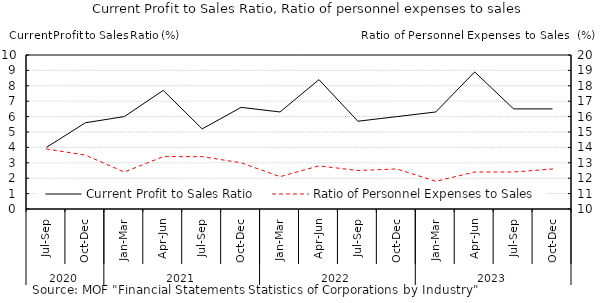
| Category | Current Profit to Sales Ratio |
|---|---|
| 0 | 4 |
| 1 | 5.6 |
| 2 | 6 |
| 3 | 7.7 |
| 4 | 5.2 |
| 5 | 6.6 |
| 6 | 6.3 |
| 7 | 8.4 |
| 8 | 5.7 |
| 9 | 6 |
| 10 | 6.3 |
| 11 | 8.9 |
| 12 | 6.5 |
| 13 | 6.5 |